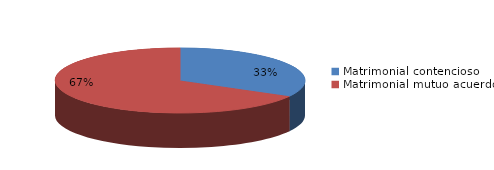
| Category | Series 0 |
|---|---|
| 0 | 311 |
| 1 | 630 |